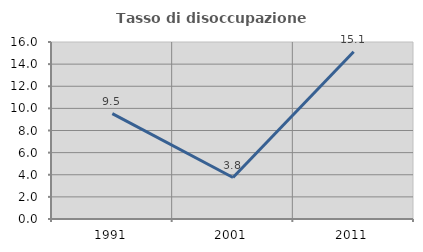
| Category | Tasso di disoccupazione giovanile  |
|---|---|
| 1991.0 | 9.524 |
| 2001.0 | 3.75 |
| 2011.0 | 15.126 |